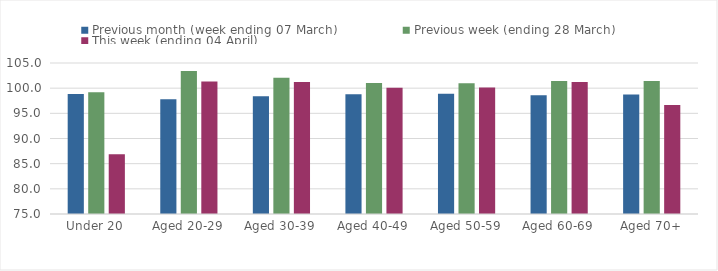
| Category | Previous month (week ending 07 March) | Previous week (ending 28 March) | This week (ending 04 April) |
|---|---|---|---|
| Under 20 | 98.864 | 99.182 | 86.869 |
| Aged 20-29 | 97.799 | 103.389 | 101.301 |
| Aged 30-39 | 98.372 | 102.08 | 101.213 |
| Aged 40-49 | 98.782 | 101.03 | 100.076 |
| Aged 50-59 | 98.88 | 100.96 | 100.125 |
| Aged 60-69 | 98.607 | 101.416 | 101.202 |
| Aged 70+ | 98.722 | 101.406 | 96.653 |